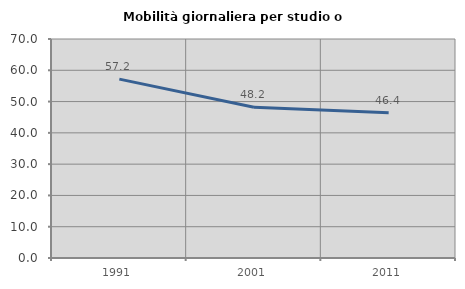
| Category | Mobilità giornaliera per studio o lavoro |
|---|---|
| 1991.0 | 57.182 |
| 2001.0 | 48.188 |
| 2011.0 | 46.416 |